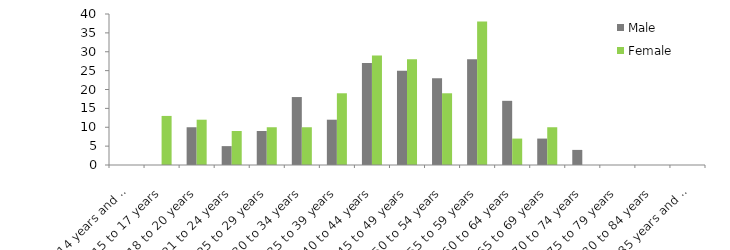
| Category | Male | Female |
|---|---|---|
| 14 years and under | 0 | 0 |
| 15 to 17 years | 0 | 13 |
| 18 to 20 years | 10 | 12 |
| 21 to 24 years | 5 | 9 |
| 25 to 29 years | 9 | 10 |
| 30 to 34 years | 18 | 10 |
| 35 to 39 years | 12 | 19 |
| 40 to 44 years | 27 | 29 |
| 45 to 49 years | 25 | 28 |
| 50 to 54 years | 23 | 19 |
| 55 to 59 years | 28 | 38 |
| 60 to 64 years | 17 | 7 |
| 65 to 69 years | 7 | 10 |
| 70 to 74 years | 4 | 0 |
| 75 to 79 years | 0 | 0 |
| 80 to 84 years | 0 | 0 |
| 85 years and over | 0 | 0 |